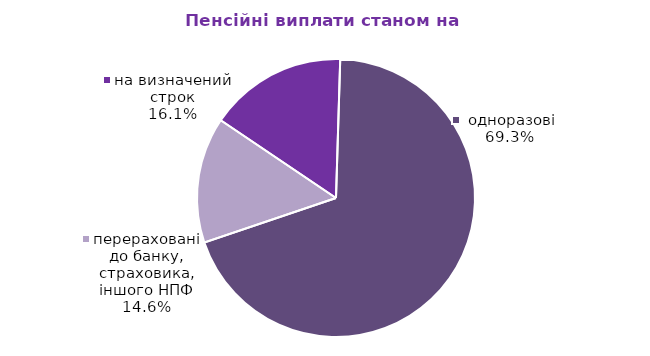
| Category | Series 0 |
|---|---|
| на визначений строк | 86.19 |
|  одноразові | 372.494 |
| перераховані до банку, страховика, іншого НПФ | 78.633 |